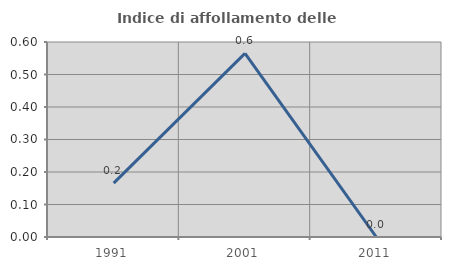
| Category | Indice di affollamento delle abitazioni  |
|---|---|
| 1991.0 | 0.166 |
| 2001.0 | 0.565 |
| 2011.0 | 0 |